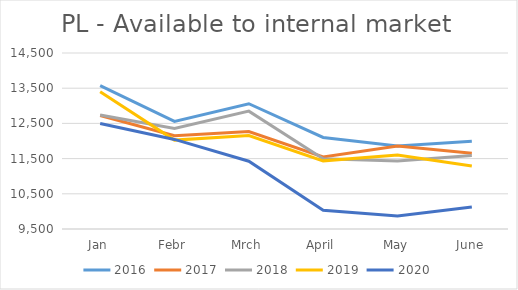
| Category | 2016 | 2017 | 2018 | 2019 | 2020 |
|---|---|---|---|---|---|
| Jan | 13574 | 12724.47 | 12738.917 | 13397.299 | 12499.487 |
| Febr | 12557 | 12151.505 | 12353.129 | 12025.119 | 12045.097 |
| Mrch | 13058 | 12270.754 | 12848.334 | 12154.313 | 11426.051 |
| April | 12101 | 11546.761 | 11498.624 | 11435.777 | 10029.338 |
| May | 11857 | 11859.97 | 11433.422 | 11603.469 | 9866.357 |
| June | 11995 | 11653.703 | 11586.661 | 11287.196 | 10121.932 |